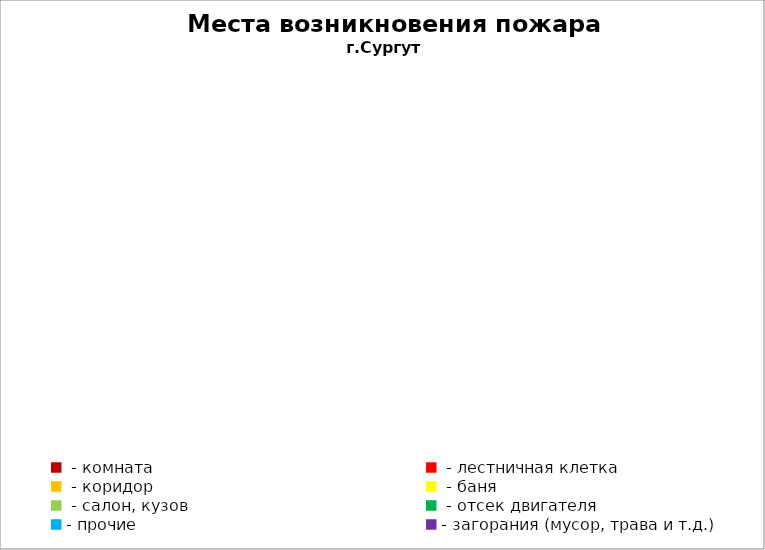
| Category | Места возникновения пожара |
|---|---|
|  - комната | 85 |
|  - лестничная клетка | 16 |
|  - коридор | 12 |
|  - баня | 50 |
|  - салон, кузов | 29 |
|  - отсек двигателя | 53 |
| - прочие | 121 |
| - загорания (мусор, трава и т.д.)  | 175 |